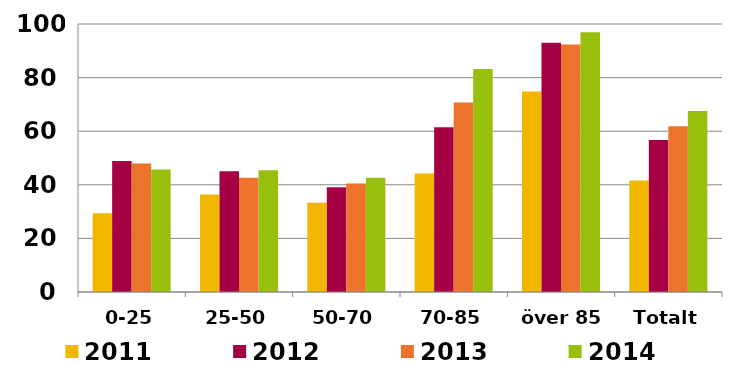
| Category | 2011 | 2012 | 2013 | 2014 |
|---|---|---|---|---|
| 0-25 | 29.423 | 48.853 | 47.98 | 45.703 |
| 25-50 | 36.358 | 45.032 | 42.6 | 45.406 |
| 50-70 | 33.289 | 39.092 | 40.513 | 42.656 |
| 70-85 | 44.241 | 61.516 | 70.682 | 83.235 |
| över 85 | 74.827 | 93.046 | 92.343 | 96.909 |
| Totalt | 41.589 | 56.695 | 61.811 | 67.527 |